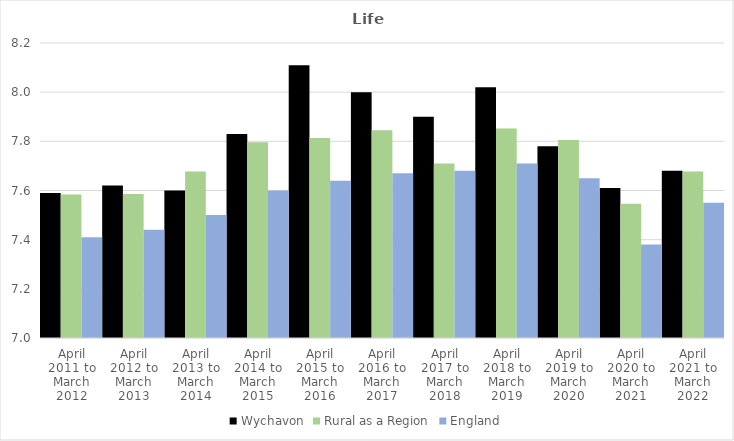
| Category | Wychavon | Rural as a Region | England |
|---|---|---|---|
| April 2011 to March 2012 | 7.59 | 7.584 | 7.41 |
| April 2012 to March 2013 | 7.62 | 7.586 | 7.44 |
| April 2013 to March 2014 | 7.6 | 7.677 | 7.5 |
| April 2014 to March 2015 | 7.83 | 7.797 | 7.6 |
| April 2015 to March 2016 | 8.11 | 7.813 | 7.64 |
| April 2016 to March 2017 | 8 | 7.845 | 7.67 |
| April 2017 to March 2018 | 7.9 | 7.71 | 7.68 |
| April 2018 to March 2019 | 8.02 | 7.852 | 7.71 |
| April 2019 to March 2020 | 7.78 | 7.806 | 7.65 |
| April 2020 to March 2021 | 7.61 | 7.546 | 7.38 |
| April 2021 to March 2022 | 7.68 | 7.677 | 7.55 |